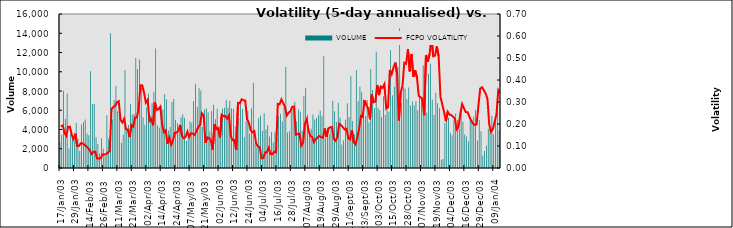
| Category | VOLUME |
|---|---|
| 2003-01-17 | 2687 |
| 2003-01-20 | 3449 |
| 2003-01-21 | 8015 |
| 2003-01-22 | 5122 |
| 2003-01-23 | 7748 |
| 2003-01-24 | 2020 |
| 2003-01-27 | 3574 |
| 2003-01-28 | 3147 |
| 2003-01-29 | 2749 |
| 2003-01-30 | 4683 |
| 2003-02-05 | 2992 |
| 2003-02-06 | 1774 |
| 2003-02-07 | 4517 |
| 2003-02-10 | 4785 |
| 2003-02-11 | 5041 |
| 2003-02-13 | 3572 |
| 2003-02-14 | 3404 |
| 2003-02-17 | 10055 |
| 2003-02-18 | 6644 |
| 2003-02-19 | 6642 |
| 2003-02-20 | 3197 |
| 2003-02-21 | 2496 |
| 2003-02-24 | 1525 |
| 2003-02-25 | 3100 |
| 2003-02-26 | 1996 |
| 2003-02-27 | 1234 |
| 2003-02-28 | 5488 |
| 2003-03-03 | 3064 |
| 2003-03-05 | 14003 |
| 2003-03-06 | 5060 |
| 2003-03-07 | 7056 |
| 2003-03-10 | 8538 |
| 2003-03-11 | 5906 |
| 2003-03-12 | 6204 |
| 2003-03-13 | 2633 |
| 2003-03-14 | 3448 |
| 2003-03-17 | 10175 |
| 2003-03-18 | 3984 |
| 2003-03-19 | 4468 |
| 2003-03-20 | 6635 |
| 2003-03-21 | 5527 |
| 2003-03-24 | 5643 |
| 2003-03-25 | 11438 |
| 2003-03-26 | 10258 |
| 2003-03-27 | 11280 |
| 2003-03-28 | 8350 |
| 2003-03-31 | 5268 |
| 2003-04-01 | 4501 |
| 2003-04-02 | 6277 |
| 2003-04-03 | 7705 |
| 2003-04-04 | 5455 |
| 2003-04-07 | 6729 |
| 2003-04-08 | 7934 |
| 2003-04-09 | 12426 |
| 2003-04-10 | 4444 |
| 2003-04-11 | 4188 |
| 2003-04-14 | 6412 |
| 2003-04-15 | 6044 |
| 2003-04-16 | 7655 |
| 2003-04-17 | 7140 |
| 2003-04-18 | 3898 |
| 2003-04-21 | 4272 |
| 2003-04-22 | 6865 |
| 2003-04-23 | 7169 |
| 2003-04-24 | 5024 |
| 2003-04-25 | 4687 |
| 2003-04-28 | 4507 |
| 2003-04-29 | 5279 |
| 2003-04-30 | 5573 |
| 2003-05-02 | 5208 |
| 2003-05-05 | 2795 |
| 2003-05-06 | 3566 |
| 2003-05-07 | 4861 |
| 2003-05-08 | 4681 |
| 2003-05-09 | 6932 |
| 2003-05-12 | 8698 |
| 2003-05-13 | 6325 |
| 2003-05-16 | 8296 |
| 2003-05-19 | 8052 |
| 2003-05-20 | 4257 |
| 2003-05-21 | 6078 |
| 2003-05-22 | 6170 |
| 2003-05-23 | 5797 |
| 2003-05-26 | 3784 |
| 2003-05-27 | 5921 |
| 2003-05-28 | 6575 |
| 2003-05-29 | 5075 |
| 2003-05-30 | 6154 |
| 2003-06-02 | 3592 |
| 2003-06-03 | 5336 |
| 2003-06-04 | 6147 |
| 2003-06-05 | 6260 |
| 2003-06-06 | 7066 |
| 2003-06-09 | 6289 |
| 2003-06-10 | 6993 |
| 2003-06-11 | 6194 |
| 2003-06-12 | 6130 |
| 2003-06-13 | 4326 |
| 2003-06-16 | 5573 |
| 2003-06-17 | 5079 |
| 2003-06-18 | 6964 |
| 2003-06-19 | 6139 |
| 2003-06-20 | 3183 |
| 2003-06-23 | 4852 |
| 2003-06-24 | 5910 |
| 2003-06-25 | 3594 |
| 2003-06-26 | 6194 |
| 2003-06-27 | 8823 |
| 2003-06-30 | 2587 |
| 2003-07-01 | 2122 |
| 2003-07-02 | 5174 |
| 2003-07-03 | 5463 |
| 2003-07-04 | 3870 |
| 2003-07-07 | 5693 |
| 2003-07-08 | 4000 |
| 2003-07-09 | 4444 |
| 2003-07-10 | 3265 |
| 2003-07-11 | 3753 |
| 2003-07-14 | 2658 |
| 2003-07-15 | 3735 |
| 2003-07-16 | 4445 |
| 2003-07-17 | 5433 |
| 2003-07-18 | 5641 |
| 2003-07-21 | 4823 |
| 2003-07-22 | 6365 |
| 2003-07-23 | 10482 |
| 2003-07-24 | 3690 |
| 2003-07-25 | 3851 |
| 2003-07-28 | 5826 |
| 2003-07-29 | 6322 |
| 2003-07-30 | 6880 |
| 2003-07-31 | 4855 |
| 2003-08-01 | 6067 |
| 2003-08-04 | 5848 |
| 2003-08-05 | 3860 |
| 2003-08-06 | 7454 |
| 2003-08-07 | 8326 |
| 2003-08-08 | 5531 |
| 2003-08-11 | 3618 |
| 2003-08-12 | 4079 |
| 2003-08-13 | 5556 |
| 2003-08-14 | 5049 |
| 2003-08-15 | 5223 |
| 2003-08-18 | 5484 |
| 2003-08-19 | 5949 |
| 2003-08-20 | 5402 |
| 2003-08-21 | 11610 |
| 2003-08-22 | 3193 |
| 2003-08-25 | 3767 |
| 2003-08-26 | 3543 |
| 2003-08-27 | 4210 |
| 2003-08-28 | 6988 |
| 2003-08-29 | 5887 |
| 2003-09-02 | 4787 |
| 2003-09-03 | 6780 |
| 2003-09-04 | 5240 |
| 2003-09-05 | 2447 |
| 2003-09-08 | 2872 |
| 2003-09-09 | 5021 |
| 2003-09-10 | 6718 |
| 2003-09-11 | 5288 |
| 2003-09-12 | 9533 |
| 2003-09-15 | 4879 |
| 2003-09-16 | 3494 |
| 2003-09-17 | 10162 |
| 2003-09-18 | 6928 |
| 2003-09-19 | 8451 |
| 2003-09-22 | 7897 |
| 2003-09-23 | 7115 |
| 2003-09-24 | 5414 |
| 2003-09-25 | 7064 |
| 2003-09-26 | 4715 |
| 2003-09-29 | 10288 |
| 2003-09-30 | 8112 |
| 2003-10-01 | 6225 |
| 2003-10-02 | 12076 |
| 2003-10-03 | 6240 |
| 2003-10-06 | 5995 |
| 2003-10-07 | 5264 |
| 2003-10-08 | 7459 |
| 2003-10-09 | 5525 |
| 2003-10-10 | 6035 |
| 2003-10-13 | 5837 |
| 2003-10-14 | 12225 |
| 2003-10-15 | 7557 |
| 2003-10-16 | 8432 |
| 2003-10-17 | 11015 |
| 2003-10-20 | 10526 |
| 2003-10-21 | 14508 |
| 2003-10-22 | 6832 |
| 2003-10-23 | 8426 |
| 2003-10-27 | 8264 |
| 2003-10-28 | 7141 |
| 2003-10-29 | 8361 |
| 2003-10-30 | 6464 |
| 2003-10-31 | 6914 |
| 2003-11-03 | 6482 |
| 2003-11-04 | 6935 |
| 2003-11-05 | 6002 |
| 2003-11-06 | 7384 |
| 2003-11-07 | 7220 |
| 2003-11-10 | 10674 |
| 2003-11-11 | 7395 |
| 2003-11-12 | 5760 |
| 2003-11-13 | 9804 |
| 2003-11-14 | 10844 |
| 2003-11-17 | 7108 |
| 2003-11-18 | 5503 |
| 2003-11-19 | 7829 |
| 2003-11-20 | 6731 |
| 2003-11-21 | 6215 |
| 2003-11-27 | 862 |
| 2003-11-28 | 947 |
| 2003-12-01 | 4682 |
| 2003-12-02 | 5090 |
| 2003-12-03 | 5233 |
| 2003-12-04 | 3675 |
| 2003-12-05 | 3409 |
| 2003-12-08 | 4934 |
| 2003-12-09 | 5656 |
| 2003-12-10 | 5017 |
| 2003-12-11 | 4080 |
| 2003-12-12 | 6157 |
| 2003-12-15 | 4797 |
| 2003-12-16 | 3484 |
| 2003-12-17 | 3262 |
| 2003-12-18 | 2770 |
| 2003-12-19 | 5237 |
| 2003-12-22 | 5011 |
| 2003-12-23 | 5346 |
| 2003-12-24 | 5991 |
| 2003-12-26 | 2849 |
| 2003-12-29 | 4981 |
| 2003-12-30 | 3809 |
| 2003-12-31 | 1294 |
| 2004-01-02 | 1766 |
| 2004-01-05 | 2319 |
| 2004-01-06 | 4067 |
| 2004-01-07 | 4017 |
| 2004-01-08 | 5429 |
| 2004-01-09 | 3500 |
| 2004-01-12 | 5385 |
| 2004-01-13 | 6086 |
| 2004-01-14 | 3867 |